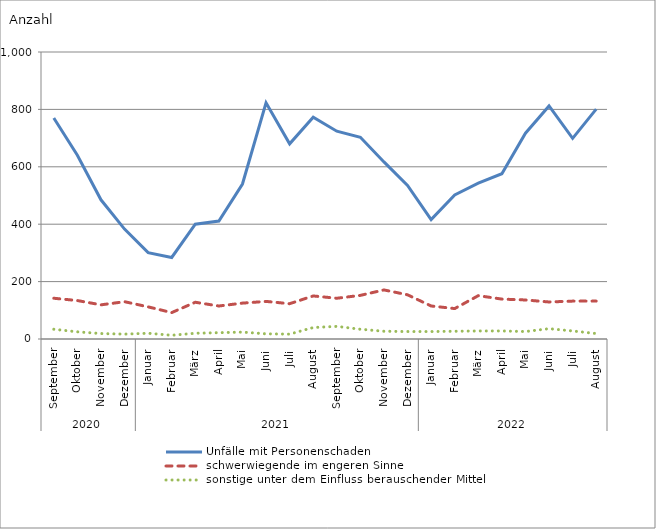
| Category | Unfälle mit Personenschaden | schwerwiegende im engeren Sinne | sonstige unter dem Einfluss berauschender Mittel |
|---|---|---|---|
| 0 | 770 | 142 | 34 |
| 1 | 640 | 134 | 25 |
| 2 | 485 | 119 | 19 |
| 3 | 383 | 130 | 17 |
| 4 | 301 | 112 | 20 |
| 5 | 284 | 92 | 13 |
| 6 | 400 | 128 | 20 |
| 7 | 411 | 115 | 22 |
| 8 | 540 | 125 | 24 |
| 9 | 823 | 131 | 18 |
| 10 | 680 | 123 | 17 |
| 11 | 773 | 150 | 40 |
| 12 | 724 | 142 | 44 |
| 13 | 703 | 152 | 34 |
| 14 | 617 | 171 | 27 |
| 15 | 535 | 154 | 26 |
| 16 | 416 | 115 | 26 |
| 17 | 502 | 106 | 27 |
| 18 | 543 | 151 | 28 |
| 19 | 576 | 139 | 28 |
| 20 | 717 | 136 | 26 |
| 21 | 812 | 129 | 36 |
| 22 | 699 | 132 | 28 |
| 23 | 801 | 132 | 19 |